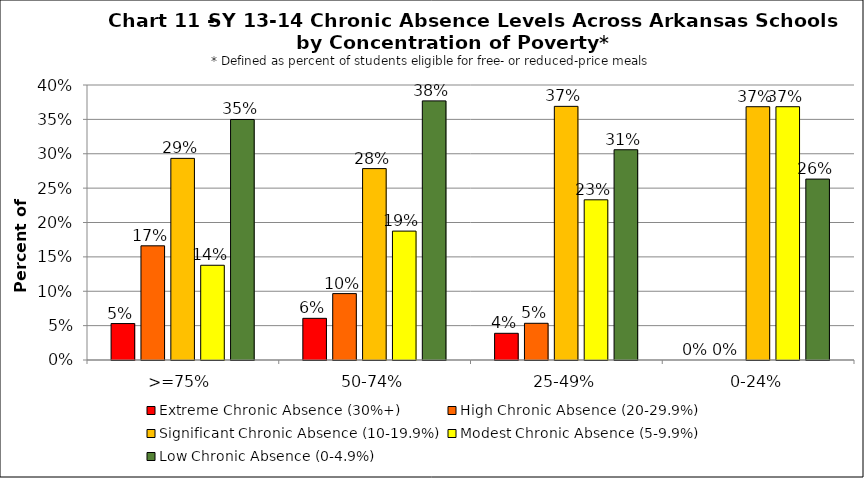
| Category | Extreme Chronic Absence (30%+) | High Chronic Absence (20-29.9%) | Significant Chronic Absence (10-19.9%) | Modest Chronic Absence (5-9.9%) | Low Chronic Absence (0-4.9%) |
|---|---|---|---|---|---|
| 0 | 0.053 | 0.166 | 0.293 | 0.138 | 0.35 |
| 1 | 0.061 | 0.097 | 0.278 | 0.188 | 0.377 |
| 2 | 0.039 | 0.053 | 0.369 | 0.233 | 0.306 |
| 3 | 0 | 0 | 0.368 | 0.368 | 0.263 |